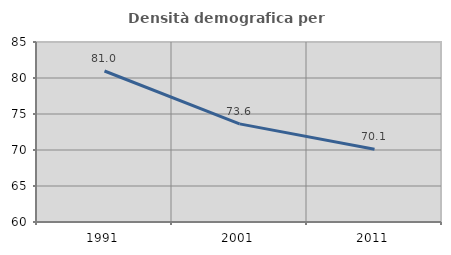
| Category | Densità demografica |
|---|---|
| 1991.0 | 80.971 |
| 2001.0 | 73.63 |
| 2011.0 | 70.107 |